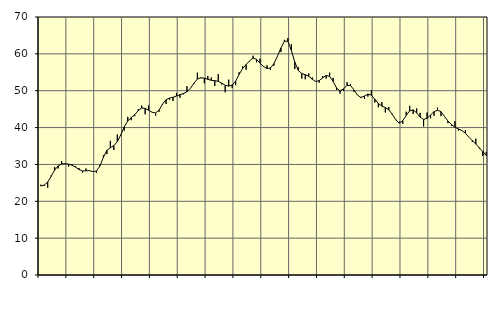
| Category | Piggar | Series 1 |
|---|---|---|
| nan | 24.5 | 24.15 |
| 87.0 | 24.2 | 24.41 |
| 87.0 | 23.7 | 25.2 |
| 87.0 | 27 | 26.77 |
| nan | 29.3 | 28.47 |
| 88.0 | 28.9 | 29.61 |
| 88.0 | 30.9 | 30.12 |
| 88.0 | 30.2 | 30.22 |
| nan | 29.4 | 30.08 |
| 89.0 | 30 | 29.78 |
| 89.0 | 29.6 | 29.28 |
| 89.0 | 29 | 28.62 |
| nan | 27.7 | 28.21 |
| 90.0 | 28.9 | 28.27 |
| 90.0 | 28.3 | 28.32 |
| 90.0 | 28.1 | 28.05 |
| nan | 27.7 | 28.22 |
| 91.0 | 29.8 | 29.57 |
| 91.0 | 32.5 | 31.93 |
| 91.0 | 32.8 | 33.83 |
| nan | 36.4 | 34.52 |
| 92.0 | 33.9 | 35.09 |
| 92.0 | 38.1 | 36.17 |
| 92.0 | 37.9 | 38.03 |
| nan | 39.2 | 40.23 |
| 93.0 | 42.9 | 41.79 |
| 93.0 | 42 | 42.71 |
| 93.0 | 43.1 | 43.48 |
| nan | 45 | 44.59 |
| 94.0 | 46 | 45.31 |
| 94.0 | 43.6 | 45.22 |
| 94.0 | 46 | 44.72 |
| nan | 44.2 | 44.16 |
| 95.0 | 43.2 | 43.96 |
| 95.0 | 44.3 | 44.74 |
| 95.0 | 46.2 | 46.39 |
| nan | 46.4 | 47.55 |
| 96.0 | 47.5 | 48 |
| 96.0 | 47.2 | 48.23 |
| 96.0 | 49.4 | 48.56 |
| nan | 48.1 | 48.92 |
| 97.0 | 49 | 49.23 |
| 97.0 | 51.2 | 49.7 |
| 97.0 | 50.6 | 50.64 |
| nan | 51.9 | 52.04 |
| 98.0 | 54.9 | 53.17 |
| 98.0 | 53.4 | 53.52 |
| 98.0 | 52 | 53.41 |
| nan | 54 | 53.09 |
| 99.0 | 53.6 | 52.82 |
| 99.0 | 51.3 | 52.73 |
| 99.0 | 54.5 | 52.54 |
| nan | 51.7 | 52.04 |
| 0.0 | 49.6 | 51.47 |
| 0.0 | 53 | 51.26 |
| 0.0 | 50.8 | 51.53 |
| nan | 51.5 | 52.61 |
| 1.0 | 55 | 54.43 |
| 1.0 | 56.6 | 56.04 |
| 1.0 | 55.7 | 57.09 |
| nan | 58 | 58.08 |
| 2.0 | 59.5 | 58.87 |
| 2.0 | 57.7 | 58.5 |
| 2.0 | 58.7 | 57.47 |
| nan | 56.7 | 56.59 |
| 3.0 | 56.9 | 56 |
| 3.0 | 55.6 | 56.19 |
| 3.0 | 56.8 | 57.35 |
| nan | 59.4 | 59.34 |
| 4.0 | 60.5 | 61.59 |
| 4.0 | 63.8 | 63.43 |
| 4.0 | 64.3 | 63.42 |
| nan | 62.6 | 60.95 |
| 5.0 | 55.9 | 57.74 |
| 5.0 | 56.4 | 55.51 |
| 5.0 | 53.3 | 54.66 |
| nan | 53.1 | 54.33 |
| 6.0 | 54.7 | 53.93 |
| 6.0 | 53.6 | 53.13 |
| 6.0 | 52.6 | 52.51 |
| nan | 52.2 | 52.74 |
| 7.0 | 54 | 53.5 |
| 7.0 | 53.3 | 54.13 |
| 7.0 | 54.9 | 53.89 |
| nan | 53.5 | 52.51 |
| 8.0 | 50.2 | 50.72 |
| 8.0 | 49.2 | 49.91 |
| 8.0 | 50 | 50.51 |
| nan | 52.3 | 51.46 |
| 9.0 | 51.8 | 51.42 |
| 9.0 | 49.7 | 50.22 |
| 9.0 | 48.8 | 48.81 |
| nan | 48 | 48.17 |
| 10.0 | 47.8 | 48.56 |
| 10.0 | 48.4 | 49.1 |
| 10.0 | 50.1 | 48.8 |
| nan | 46.8 | 47.67 |
| 11.0 | 45.5 | 46.52 |
| 11.0 | 46.9 | 45.83 |
| 11.0 | 44.1 | 45.47 |
| nan | 45.6 | 44.81 |
| 12.0 | 43.4 | 43.62 |
| 12.0 | 42 | 42.13 |
| 12.0 | 41.6 | 41.2 |
| nan | 41 | 41.84 |
| 13.0 | 44.3 | 43.32 |
| 13.0 | 45.9 | 44.52 |
| 13.0 | 43.7 | 44.82 |
| nan | 45.2 | 44 |
| 14.0 | 44 | 42.82 |
| 14.0 | 40.3 | 42.21 |
| 14.0 | 44.1 | 42.5 |
| nan | 42.5 | 43.41 |
| 15.0 | 43.2 | 44.33 |
| 15.0 | 45.4 | 44.72 |
| 15.0 | 43.1 | 44.31 |
| nan | 43.1 | 43.02 |
| 16.0 | 41.2 | 41.78 |
| 16.0 | 40.5 | 40.83 |
| 16.0 | 41.7 | 40.1 |
| nan | 39.2 | 39.63 |
| 17.0 | 39.2 | 39.18 |
| 17.0 | 39.3 | 38.49 |
| 17.0 | 37.4 | 37.41 |
| nan | 36.1 | 36.46 |
| 18.0 | 37 | 35.54 |
| 18.0 | 34.3 | 34.52 |
| 18.0 | 32.3 | 33.51 |
| nan | 33.4 | 32.42 |